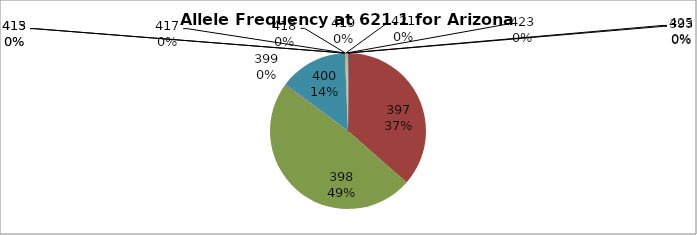
| Category | Series 0 |
|---|---|
| 393.0 | 0.002 |
| 397.0 | 0.362 |
| 398.0 | 0.486 |
| 399.0 | 0.002 |
| 400.0 | 0.141 |
| 413.0 | 0 |
| 415.0 | 0 |
| 417.0 | 0 |
| 418.0 | 0.002 |
| 419.0 | 0 |
| 421.0 | 0 |
| 423.0 | 0.002 |
| 425.0 | 0.002 |